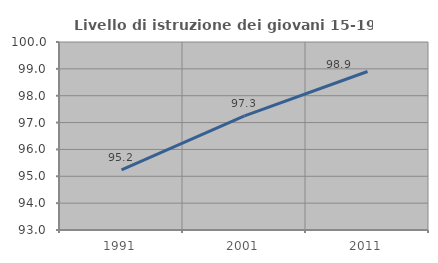
| Category | Livello di istruzione dei giovani 15-19 anni |
|---|---|
| 1991.0 | 95.235 |
| 2001.0 | 97.251 |
| 2011.0 | 98.902 |